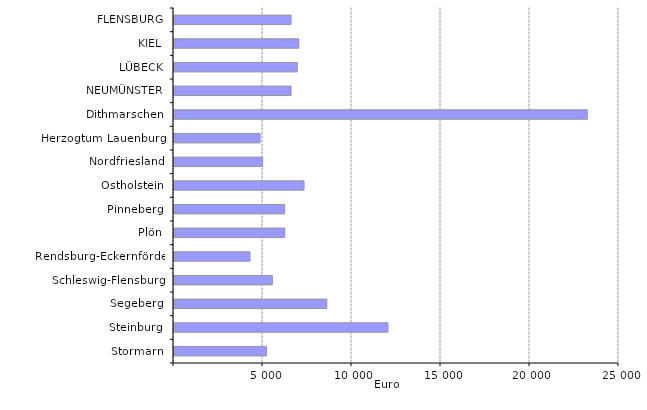
| Category | Series 0 |
|---|---|
| Stormarn | 5201 |
| Steinburg | 12021 |
| Segeberg | 8586 |
| Schleswig-Flensburg | 5526 |
| Rendsburg-Eckernförde | 4269 |
| Plön | 6222 |
| Pinneberg | 6219 |
| Ostholstein | 7307 |
| Nordfriesland | 4980 |
| Herzogtum Lauenburg | 4836 |
| Dithmarschen | 23217 |
| NEUMÜNSTER | 6577 |
| LÜBECK | 6927 |
| KIEL | 7013 |
| FLENSBURG | 6576 |